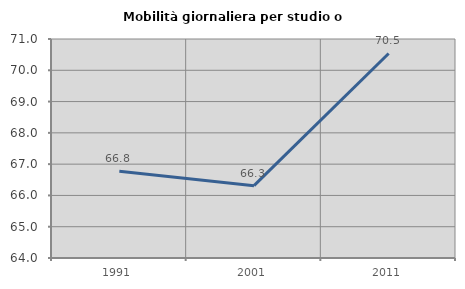
| Category | Mobilità giornaliera per studio o lavoro |
|---|---|
| 1991.0 | 66.773 |
| 2001.0 | 66.313 |
| 2011.0 | 70.537 |